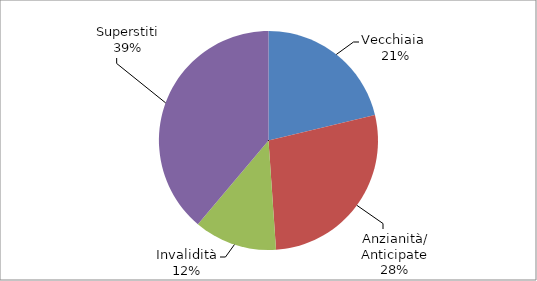
| Category | Series 0 |
|---|---|
| Vecchiaia  | 10244 |
| Anzianità/ Anticipate | 13342 |
| Invalidità | 5910 |
| Superstiti | 18732 |